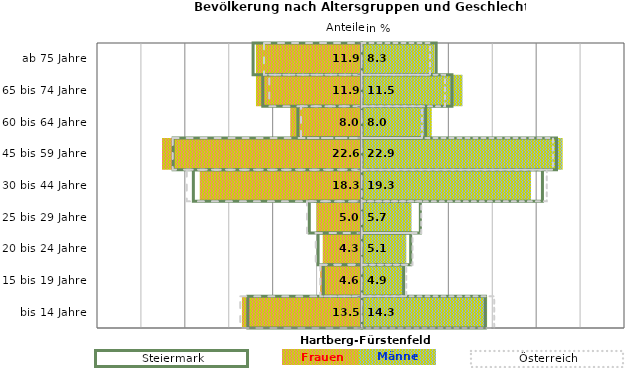
| Category | Frauen | Männer | Frauen Spalte2 | Männer Spalte2 | Frauen Spalte3 | Männer Spalte3 |
|---|---|---|---|---|---|---|
| bis 14 Jahre | -13.5 | 14.3 | 14.1 | -13 | -13.8 | 15.1 |
| 15 bis 19 Jahre | -4.6 | 4.9 | 4.8 | -4.4 | -4.7 | 5.1 |
| 20 bis 24 Jahre | -4.3 | 5.1 | 5.6 | -5 | -5.2 | 5.8 |
| 25 bis 29 Jahre | -5 | 5.7 | 6.7 | -6 | -6.2 | 6.8 |
| 30 bis 44 Jahre | -18.3 | 19.3 | 20.6 | -19.2 | -19.9 | 21.1 |
| 45 bis 59 Jahre | -22.6 | 22.9 | 22.2 | -21.5 | -21.5 | 21.8 |
| 60 bis 64 Jahre | -8 | 8 | 7.3 | -7.3 | -6.9 | 6.9 |
| 65 bis 74 Jahre | -11.9 | 11.5 | 10.3 | -11.3 | -10.5 | 9.5 |
| ab 75 Jahre | -11.9 | 8.3 | 8.5 | -12.4 | -11.1 | 7.8 |